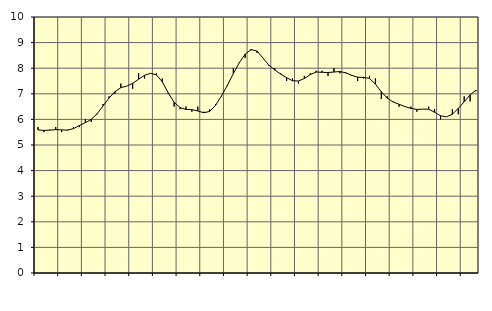
| Category | Piggar | Series 1 |
|---|---|---|
| nan | 5.7 | 5.59 |
| 1.0 | 5.5 | 5.57 |
| 1.0 | 5.6 | 5.58 |
| 1.0 | 5.7 | 5.6 |
| nan | 5.5 | 5.59 |
| 2.0 | 5.6 | 5.58 |
| 2.0 | 5.7 | 5.64 |
| 2.0 | 5.7 | 5.76 |
| nan | 6 | 5.87 |
| 3.0 | 5.9 | 6 |
| 3.0 | 6.2 | 6.22 |
| 3.0 | 6.6 | 6.53 |
| nan | 6.9 | 6.83 |
| 4.0 | 7 | 7.08 |
| 4.0 | 7.4 | 7.24 |
| 4.0 | 7.3 | 7.3 |
| nan | 7.2 | 7.41 |
| 5.0 | 7.8 | 7.57 |
| 5.0 | 7.6 | 7.72 |
| 5.0 | 7.8 | 7.8 |
| nan | 7.8 | 7.74 |
| 6.0 | 7.6 | 7.47 |
| 6.0 | 7 | 7.04 |
| 6.0 | 6.5 | 6.67 |
| nan | 6.4 | 6.46 |
| 7.0 | 6.5 | 6.39 |
| 7.0 | 6.3 | 6.38 |
| 7.0 | 6.5 | 6.33 |
| nan | 6.3 | 6.26 |
| 8.0 | 6.4 | 6.31 |
| 8.0 | 6.6 | 6.55 |
| 8.0 | 6.9 | 6.92 |
| nan | 7.3 | 7.33 |
| 9.0 | 8 | 7.79 |
| 9.0 | 8.2 | 8.21 |
| 9.0 | 8.4 | 8.55 |
| nan | 8.7 | 8.73 |
| 10.0 | 8.6 | 8.67 |
| 10.0 | 8.4 | 8.4 |
| 10.0 | 8.1 | 8.12 |
| nan | 8 | 7.93 |
| 11.0 | 7.8 | 7.77 |
| 11.0 | 7.5 | 7.63 |
| 11.0 | 7.6 | 7.51 |
| nan | 7.4 | 7.5 |
| 12.0 | 7.7 | 7.6 |
| 12.0 | 7.8 | 7.75 |
| 12.0 | 7.9 | 7.85 |
| nan | 7.9 | 7.84 |
| 13.0 | 7.7 | 7.83 |
| 13.0 | 8 | 7.85 |
| 13.0 | 7.8 | 7.87 |
| nan | 7.8 | 7.82 |
| 14.0 | 7.7 | 7.72 |
| 14.0 | 7.5 | 7.65 |
| 14.0 | 7.6 | 7.64 |
| nan | 7.7 | 7.6 |
| 15.0 | 7.6 | 7.38 |
| 15.0 | 6.8 | 7.08 |
| 15.0 | 6.9 | 6.83 |
| nan | 6.7 | 6.68 |
| 16.0 | 6.5 | 6.59 |
| 16.0 | 6.5 | 6.5 |
| 16.0 | 6.5 | 6.43 |
| nan | 6.3 | 6.39 |
| 17.0 | 6.4 | 6.4 |
| 17.0 | 6.5 | 6.4 |
| 17.0 | 6.4 | 6.28 |
| nan | 6 | 6.14 |
| 18.0 | 6.1 | 6.1 |
| 18.0 | 6.4 | 6.2 |
| 18.0 | 6.2 | 6.43 |
| nan | 6.9 | 6.69 |
| 19.0 | 6.7 | 6.96 |
| 19.0 | 7.1 | 7.14 |